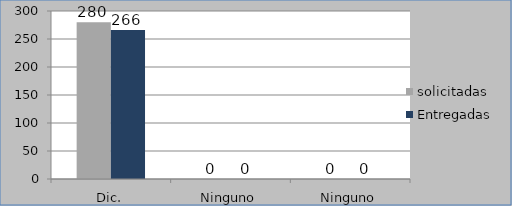
| Category | solicitadas | Entregadas |
|---|---|---|
| Dic. | 280 | 266 |
| Ninguno | 0 | 0 |
| Ninguno | 0 | 0 |